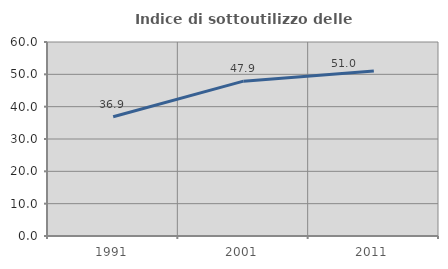
| Category | Indice di sottoutilizzo delle abitazioni  |
|---|---|
| 1991.0 | 36.877 |
| 2001.0 | 47.89 |
| 2011.0 | 51.036 |